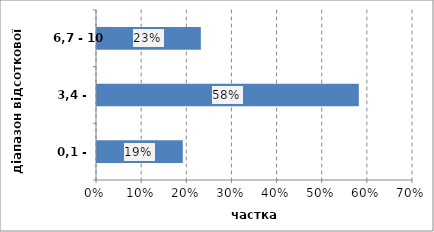
| Category | Series 0 |
|---|---|
| 0,1 - 3,4 | 0.19 |
| 3,4 - 6,7 | 0.58 |
| 6,7 - 10 | 0.23 |